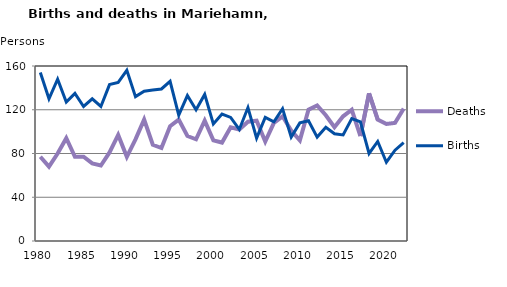
| Category | Deaths | Births |
|---|---|---|
| 1980.0 | 77 | 154 |
| 1981.0 | 68 | 130 |
| 1982.0 | 80 | 148 |
| 1983.0 | 94 | 127 |
| 1984.0 | 77 | 135 |
| 1985.0 | 77 | 123 |
| 1986.0 | 71 | 130 |
| 1987.0 | 69 | 123 |
| 1988.0 | 81 | 143 |
| 1989.0 | 97 | 145 |
| 1990.0 | 77 | 156 |
| 1991.0 | 93 | 132 |
| 1992.0 | 111 | 137 |
| 1993.0 | 88 | 138 |
| 1994.0 | 85 | 139 |
| 1995.0 | 105 | 146 |
| 1996.0 | 111 | 115 |
| 1997.0 | 96 | 133 |
| 1998.0 | 93 | 120 |
| 1999.0 | 110 | 134 |
| 2000.0 | 92 | 107 |
| 2001.0 | 90 | 116 |
| 2002.0 | 104 | 113 |
| 2003.0 | 102 | 102 |
| 2004.0 | 109 | 122 |
| 2005.0 | 110 | 94 |
| 2006.0 | 91 | 113 |
| 2007.0 | 108 | 109 |
| 2008.0 | 114 | 121 |
| 2009.0 | 101 | 95 |
| 2010.0 | 92 | 108 |
| 2011.0 | 120 | 110 |
| 2012.0 | 124 | 95 |
| 2013.0 | 115 | 104 |
| 2014.0 | 104 | 98 |
| 2015.0 | 114 | 97 |
| 2016.0 | 120 | 112 |
| 2017.0 | 96 | 109 |
| 2018.0 | 135 | 80 |
| 2019.0 | 111 | 91 |
| 2020.0 | 107 | 72 |
| 2021.0 | 108 | 83 |
| 2022.0 | 121 | 90 |